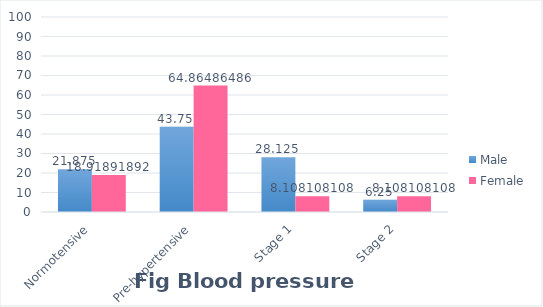
| Category | Male | Female |
|---|---|---|
| Normotensive | 21.875 | 18.919 |
| Pre-hypertensive | 43.75 | 64.865 |
| Stage 1 | 28.125 | 8.108 |
| Stage 2 | 6.25 | 8.108 |